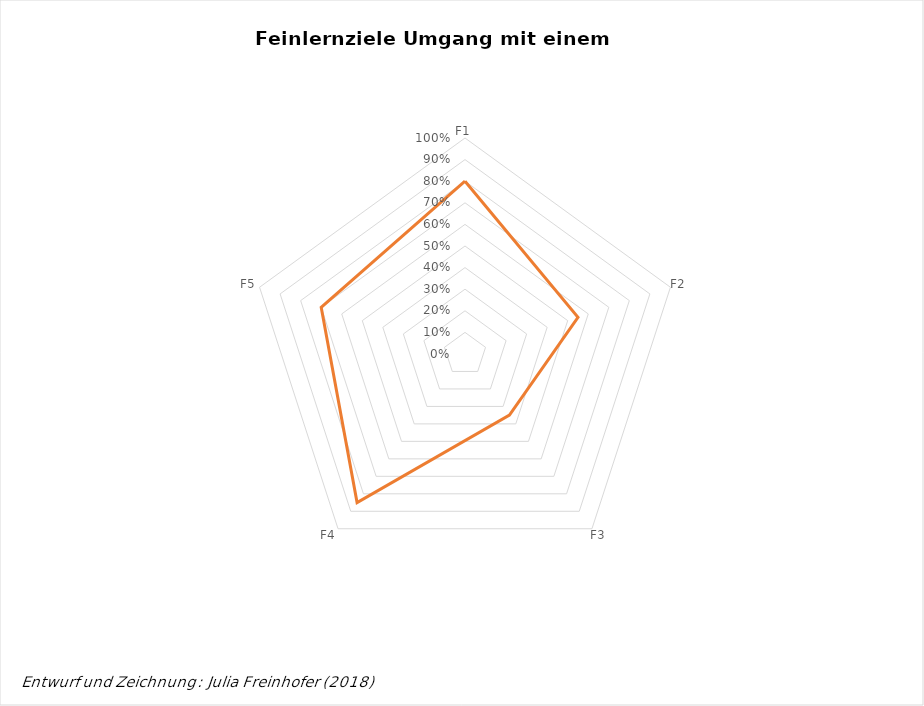
| Category | Series 0 |
|---|---|
| F1 | 0.8 |
| F2 | 0.55 |
| F3 | 0.35 |
| F4 | 0.85 |
| F5 | 0.7 |